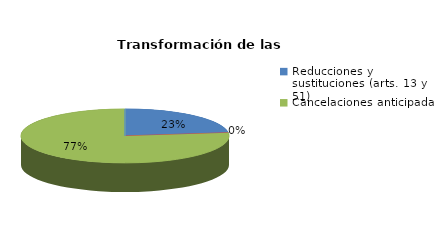
| Category | Series 0 |
|---|---|
| Reducciones y sustituciones (arts. 13 y 51) | 3 |
| Por quebrantamiento (art. 50.2) | 0 |
| Cancelaciones anticipadas | 10 |
| Traslado a Centros Penitenciarios | 0 |
| Conversión internamientos en cerrados (art. 51.2) | 0 |